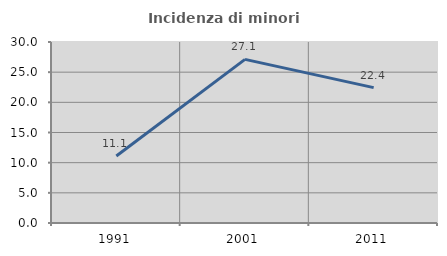
| Category | Incidenza di minori stranieri |
|---|---|
| 1991.0 | 11.111 |
| 2001.0 | 27.119 |
| 2011.0 | 22.432 |